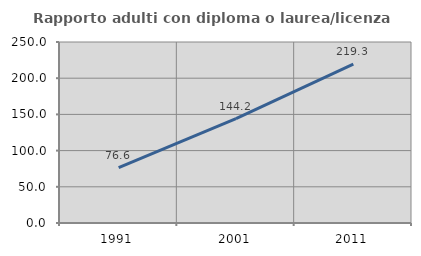
| Category | Rapporto adulti con diploma o laurea/licenza media  |
|---|---|
| 1991.0 | 76.558 |
| 2001.0 | 144.242 |
| 2011.0 | 219.342 |